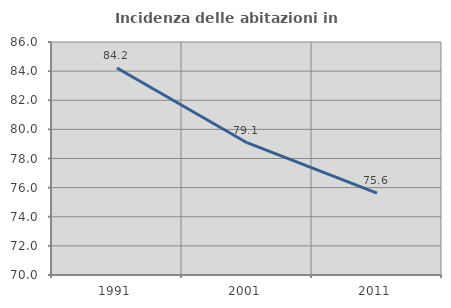
| Category | Incidenza delle abitazioni in proprietà  |
|---|---|
| 1991.0 | 84.211 |
| 2001.0 | 79.085 |
| 2011.0 | 75.625 |